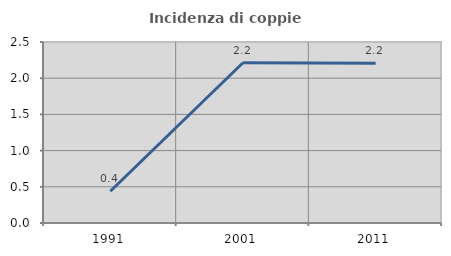
| Category | Incidenza di coppie miste |
|---|---|
| 1991.0 | 0.439 |
| 2001.0 | 2.214 |
| 2011.0 | 2.208 |